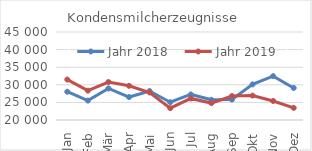
| Category | Jahr 2018 | Jahr 2019 |
|---|---|---|
| Jan | 28036.805 | 31489.474 |
| Feb | 25517.587 | 28337.53 |
| Mär | 28966.313 | 30795.709 |
| Apr | 26516.738 | 29709.673 |
| Mai | 28225.61 | 27814.744 |
| Jun | 25052.39 | 23359.288 |
| Jul | 27259.635 | 26122.024 |
| Aug | 25742.576 | 24807.966 |
| Sep | 25803.366 | 26807.512 |
| Okt | 30115.644 | 26943.014 |
| Nov | 32458.119 | 25402.7 |
| Dez | 29103.044 | 23447.352 |